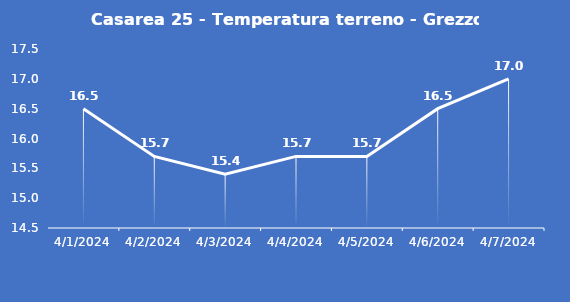
| Category | Casarea 25 - Temperatura terreno - Grezzo (°C) |
|---|---|
| 4/1/24 | 16.5 |
| 4/2/24 | 15.7 |
| 4/3/24 | 15.4 |
| 4/4/24 | 15.7 |
| 4/5/24 | 15.7 |
| 4/6/24 | 16.5 |
| 4/7/24 | 17 |